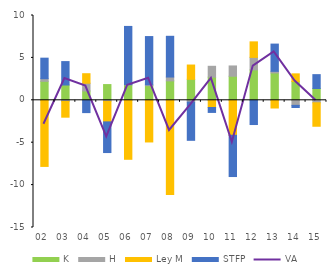
| Category | K | H | Ley M | STFP |
|---|---|---|---|---|
| 0 | 2.239 | 0.311 | -7.798 | 2.418 |
| 1900-01-01 | 1.804 | -0.142 | -1.848 | 2.761 |
| 1900-01-02 | 1.101 | 0.908 | 1.126 | -1.452 |
| 1900-01-03 | 1.854 | -0.122 | -2.421 | -3.619 |
| 1900-01-04 | 1.826 | 0.022 | -6.957 | 6.864 |
| 1900-01-05 | 1.723 | 0.107 | -4.913 | 5.685 |
| 1900-01-06 | 2.291 | 0.454 | -11.106 | 4.803 |
| 1900-01-07 | 2.471 | -0.211 | 1.687 | -4.508 |
| 1900-01-08 | 2.733 | 1.277 | -0.852 | -0.579 |
| 1900-01-09 | 2.839 | 1.211 | -4.125 | -4.866 |
| 1900-01-10 | 3.586 | 1.474 | 1.831 | -2.858 |
| 1900-01-11 | 3.225 | 0.19 | -0.909 | 3.213 |
| 1900-01-12 | 2.21 | -0.597 | 0.909 | -0.254 |
| 1900-01-13 | 1.389 | -0.294 | -2.766 | 1.637 |